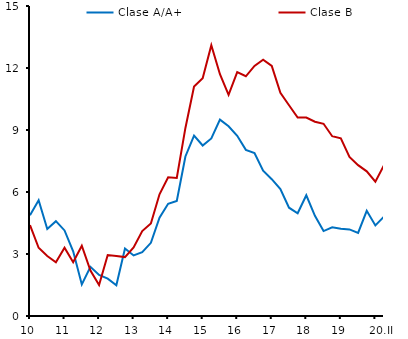
| Category | Clase A/A+ | Clase B |
|---|---|---|
| 10 | 4.88 | 4.4 |
|  | 5.6 | 3.3 |
|  | 4.21 | 2.9 |
|  | 4.59 | 2.6 |
| 11 | 4.14 | 3.3 |
|  | 3.13 | 2.6 |
|  | 1.53 | 3.4 |
|  | 2.38 | 2.2 |
| 12 | 1.99 | 1.5 |
|  | 1.81 | 2.95 |
|  | 1.49 | 2.9 |
|  | 3.27 | 2.85 |
| 13 | 2.93 | 3.32 |
|  | 3.09 | 4.11 |
|  | 3.54 | 4.48 |
|  | 4.76 | 5.89 |
| 14 | 5.43 | 6.71 |
|  | 5.57 | 6.68 |
|  | 7.72 | 9.1 |
|  | 8.73 | 11.1 |
| 15 | 8.25 | 11.5 |
|  | 8.59 | 13.1 |
|  | 9.5 | 11.7 |
|  | 9.18 | 10.7 |
| 16 | 8.72 | 11.8 |
|  | 8.04 | 11.6 |
|  | 7.89 | 12.1 |
|  | 7.03 | 12.4 |
| 17 | 6.62 | 12.1 |
|  | 6.14 | 10.8 |
|  | 5.24 | 10.2 |
|  | 4.97 | 9.6 |
| 18 | 5.84 | 9.6 |
|  | 4.85 | 9.4 |
|  | 4.11 | 9.3 |
|  | 4.29 | 8.7 |
| 19 | 4.22 | 8.6 |
|  | 4.19 | 7.7 |
|  | 4.02 | 7.3 |
|  | 5.09 | 7 |
|  | 4.38 | 6.5 |
| 20.II | 4.81 | 7.3 |